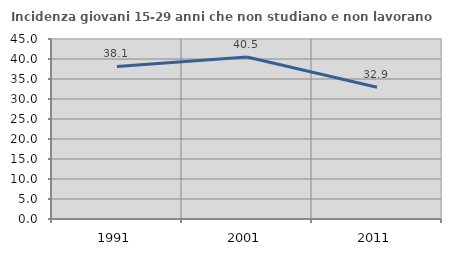
| Category | Incidenza giovani 15-29 anni che non studiano e non lavorano  |
|---|---|
| 1991.0 | 38.129 |
| 2001.0 | 40.504 |
| 2011.0 | 32.948 |